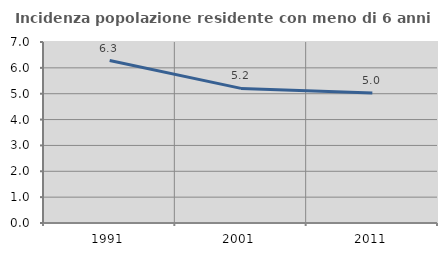
| Category | Incidenza popolazione residente con meno di 6 anni |
|---|---|
| 1991.0 | 6.284 |
| 2001.0 | 5.206 |
| 2011.0 | 5.027 |